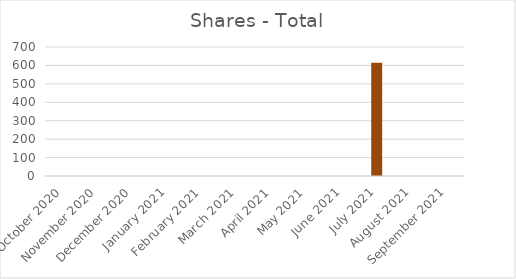
| Category | Total |
|---|---|
| October 2020 | 0 |
| November 2020 | 0 |
| December 2020 | 0 |
| January 2021 | 0 |
| February 2021 | 0 |
| March 2021 | 0 |
| April 2021 | 0 |
| May 2021 | 0 |
| June 2021 | 0 |
| July 2021 | 614 |
| August 2021 | 0 |
| September 2021 | 0 |